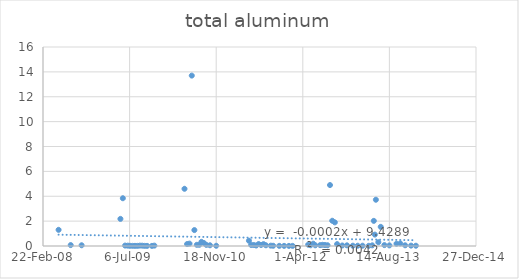
| Category | Series 0 |
|---|---|
| 39590.0 | 1.3 |
| 39660.0 | 0.074 |
| 39723.0 | 0.059 |
| 39947.0 | 2.18 |
| 39961.0 | 3.84 |
| 39974.0 | 0.035 |
| 39989.0 | 0.028 |
| 40002.0 | 0.016 |
| 40017.0 | 0.012 |
| 40031.0 | 0.012 |
| 40045.0 | 0.011 |
| 40059.0 | 0.03 |
| 40073.0 | 0.026 |
| 40087.0 | 0.011 |
| 40101.0 | 0.01 |
| 40129.0 | 0.009 |
| 40143.0 | 0.03 |
| 40317.0 | 4.6 |
| 40332.0 | 0.157 |
| 40346.0 | 0.191 |
| 40359.0 | 13.7 |
| 40374.0 | 1.28 |
| 40388.0 | 0.096 |
| 40402.0 | 0.095 |
| 40415.0 | 0.334 |
| 40429.0 | 0.24 |
| 40443.0 | 0.087 |
| 40464.0 | 0.058 |
| 40500.0 | 0.018 |
| 40689.0 | 0.422 |
| 40702.0 | 0.079 |
| 40717.0 | 0.079 |
| 40731.0 | 0.04 |
| 40745.0 | 0.156 |
| 40759.0 | 0.082 |
| 40773.0 | 0.151 |
| 40787.0 | 0.058 |
| 40815.0 | 0.028 |
| 40829.0 | 0.019 |
| 40864.0 | 0.012 |
| 40892.0 | 0.01 |
| 40920.0 | 0.009 |
| 40941.0 | 0.009 |
| 41031.0 | 0.103 |
| 41045.0 | 0.058 |
| 41060.0 | 0.186 |
| 41072.0 | 0.056 |
| 41100.0 | 0.07 |
| 41114.0 | 0.096 |
| 41128.0 | 0.077 |
| 41143.0 | 0.06 |
| 41157.0 | 4.9 |
| 41170.0 | 2.03 |
| 41185.0 | 1.9 |
| 41198.0 | 0.152 |
| 41228.0 | 0.042 |
| 41255.0 | 0.053 |
| 41289.0 | 0.024 |
| 41317.0 | 0.023 |
| 41345.0 | 0.024 |
| 41381.0 | 0.015 |
| 41401.0 | 0.054 |
| 41410.0 | 2.02 |
| 41416.0 | 0.916 |
| 41422.0 | 3.72 |
| 41436.0 | 0.302 |
| 41450.0 | 1.54 |
| 41471.0 | 0.073 |
| 41500.0 | 0.048 |
| 41541.0 | 0.182 |
| 41563.0 | 0.205 |
| 41591.0 | 0.057 |
| 41625.0 | 0.03 |
| 41653.0 | 0.022 |